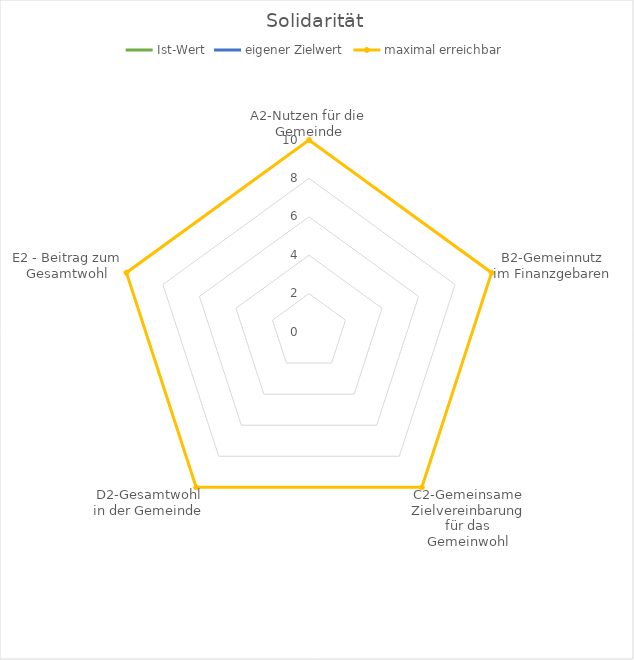
| Category | Ist-Wert | eigener Zielwert | maximal erreichbar |
|---|---|---|---|
| A2-Nutzen für die Gemeinde | 0 | 0 | 10 |
| B2-Gemeinnutz im Finanzgebaren | 0 | 0 | 10 |
| C2-Gemeinsame Zielvereinbarung für das Gemeinwohl | 0 | 0 | 10 |
| D2-Gesamtwohl in der Gemeinde | 0 | 0 | 10 |
| E2 - Beitrag zum Gesamtwohl | 0 | 0 | 10 |